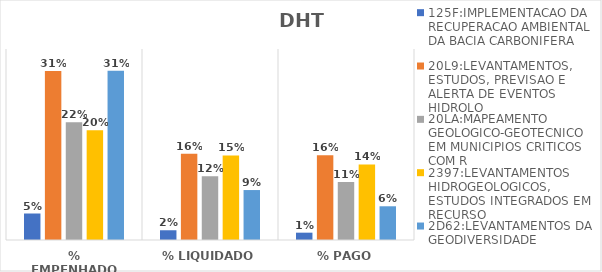
| Category | 125F:IMPLEMENTACAO DA RECUPERACAO AMBIENTAL DA BACIA CARBONIFERA | 20L9:LEVANTAMENTOS, ESTUDOS, PREVISAO E ALERTA DE EVENTOS HIDROLO | 20LA:MAPEAMENTO GEOLOGICO-GEOTECNICO EM MUNICIPIOS CRITICOS COM R | 2397:LEVANTAMENTOS HIDROGEOLOGICOS, ESTUDOS INTEGRADOS EM RECURSO | 2D62:LEVANTAMENTOS DA GEODIVERSIDADE |
|---|---|---|---|---|---|
| % EMPENHADO | 0.049 | 0.309 | 0.216 | 0.201 | 0.31 |
| % LIQUIDADO | 0.018 | 0.158 | 0.117 | 0.155 | 0.092 |
| % PAGO | 0.013 | 0.155 | 0.106 | 0.138 | 0.062 |